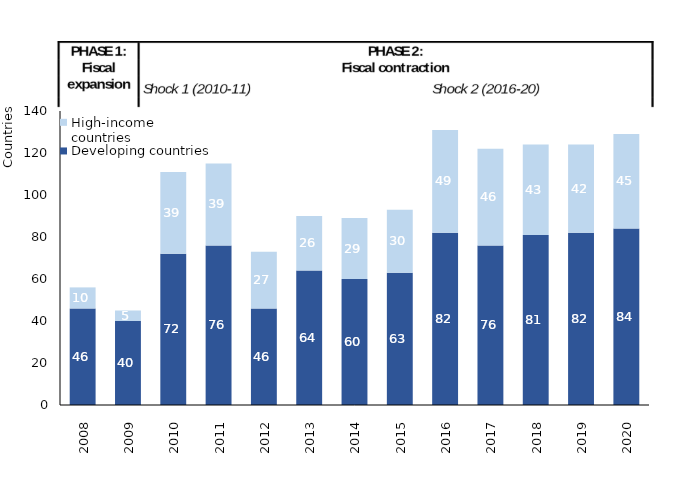
| Category | Developing countries | High-income countries |
|---|---|---|
| 2008.0 | 46 | 10 |
| 2009.0 | 40 | 5 |
| 2010.0 | 72 | 39 |
| 2011.0 | 76 | 39 |
| 2012.0 | 46 | 27 |
| 2013.0 | 64 | 26 |
| 2014.0 | 60 | 29 |
| 2015.0 | 63 | 30 |
| 2016.0 | 82 | 49 |
| 2017.0 | 76 | 46 |
| 2018.0 | 81 | 43 |
| 2019.0 | 82 | 42 |
| 2020.0 | 84 | 45 |